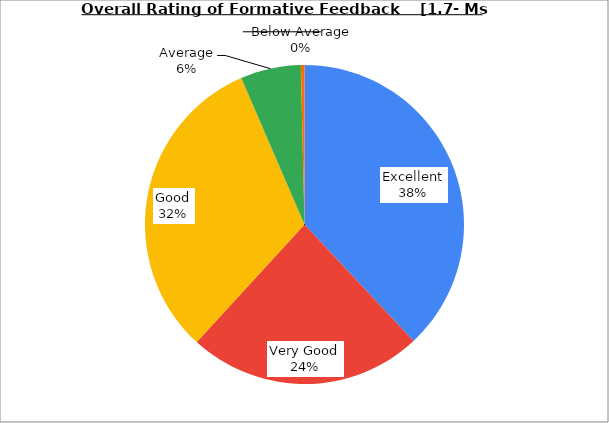
| Category | Series 0 |
|---|---|
| Excellent | 38.018 |
| Very Good | 23.784 |
| Good | 31.712 |
| Average | 6.126 |
| Below Average | 0.36 |